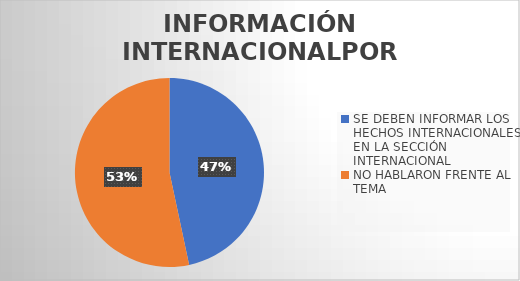
| Category | Series 0 |
|---|---|
| SE DEBEN INFORMAR LOS HECHOS INTERNACIONALES EN LA SECCIÓN INTERNACIONAL | 7 |
| NO HABLARON FRENTE AL TEMA | 8 |